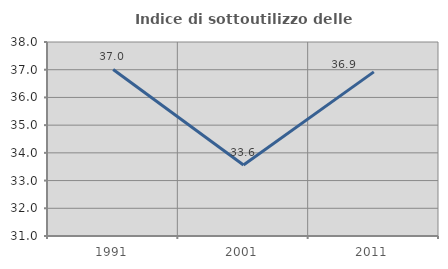
| Category | Indice di sottoutilizzo delle abitazioni  |
|---|---|
| 1991.0 | 37.008 |
| 2001.0 | 33.564 |
| 2011.0 | 36.923 |